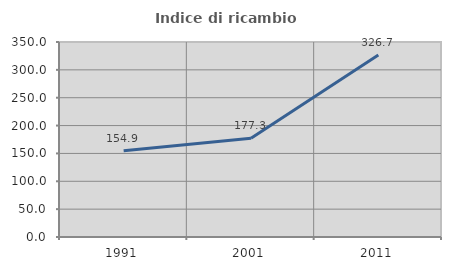
| Category | Indice di ricambio occupazionale  |
|---|---|
| 1991.0 | 154.867 |
| 2001.0 | 177.273 |
| 2011.0 | 326.667 |